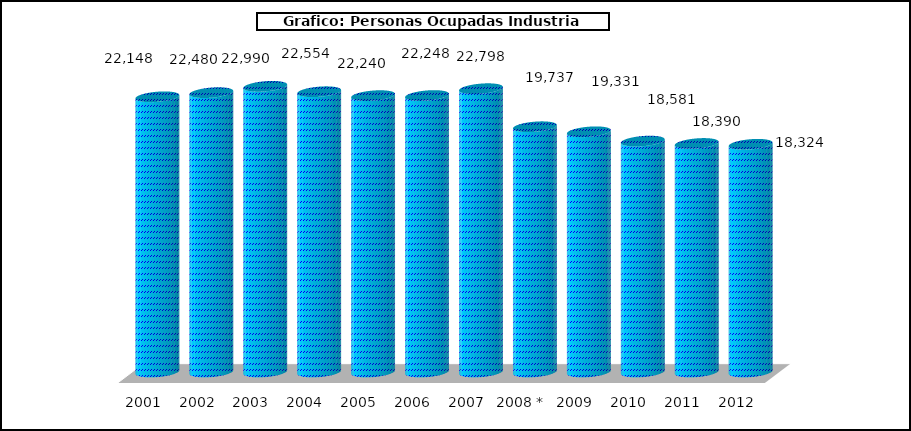
| Category |  Personas Ocupadas Industria Pesquera |
|---|---|
| 2001 | 22148 |
| 2002 | 22480 |
| 2003 | 22990 |
| 2004 | 22554 |
| 2005 | 22240 |
| 2006 | 22248 |
| 2007 | 22798 |
| 2008 * | 19737 |
| 2009 | 19331 |
| 2010 | 18581 |
| 2011 | 18390 |
| 2012 | 18324 |